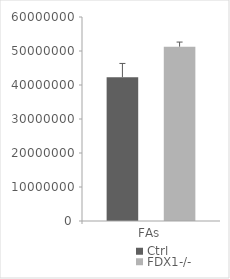
| Category | Ctrl | FDX1-/- |
|---|---|---|
| FAs | 42293312.538 | 51275872.162 |